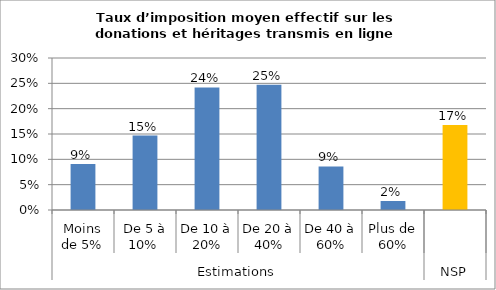
| Category | Series 0 |
|---|---|
| 0 | 0.091 |
| 1 | 0.147 |
| 2 | 0.242 |
| 3 | 0.247 |
| 4 | 0.086 |
| 5 | 0.018 |
| 6 | 0.168 |